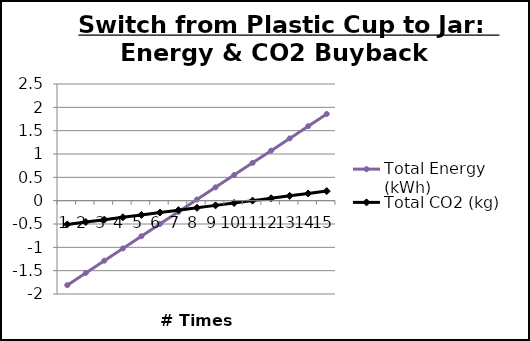
| Category | Total Energy (kWh) | Total CO2 (kg) |
|---|---|---|
| 0 | -1.81 | -0.509 |
| 1 | -1.548 | -0.458 |
| 2 | -1.286 | -0.407 |
| 3 | -1.024 | -0.356 |
| 4 | -0.762 | -0.305 |
| 5 | -0.5 | -0.254 |
| 6 | -0.238 | -0.203 |
| 7 | 0.024 | -0.152 |
| 8 | 0.286 | -0.101 |
| 9 | 0.548 | -0.05 |
| 10 | 0.81 | 0.001 |
| 11 | 1.072 | 0.052 |
| 12 | 1.334 | 0.103 |
| 13 | 1.596 | 0.154 |
| 14 | 1.858 | 0.205 |